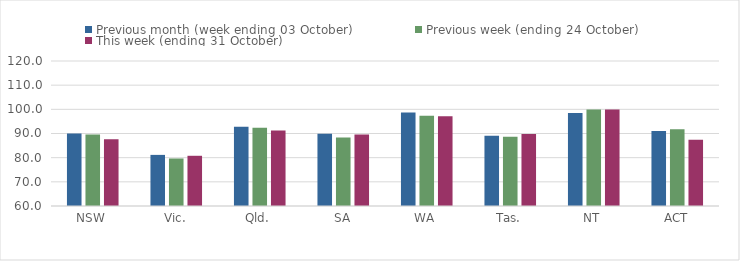
| Category | Previous month (week ending 03 October) | Previous week (ending 24 October) | This week (ending 31 October) |
|---|---|---|---|
| NSW | 90.02 | 89.57 | 87.64 |
| Vic. | 81.15 | 79.66 | 80.78 |
| Qld. | 92.76 | 92.39 | 91.19 |
| SA | 89.92 | 88.33 | 89.6 |
| WA | 98.64 | 97.38 | 97.14 |
| Tas. | 89.07 | 88.67 | 89.82 |
| NT | 98.44 | 99.9 | 99.98 |
| ACT | 91.02 | 91.74 | 87.4 |